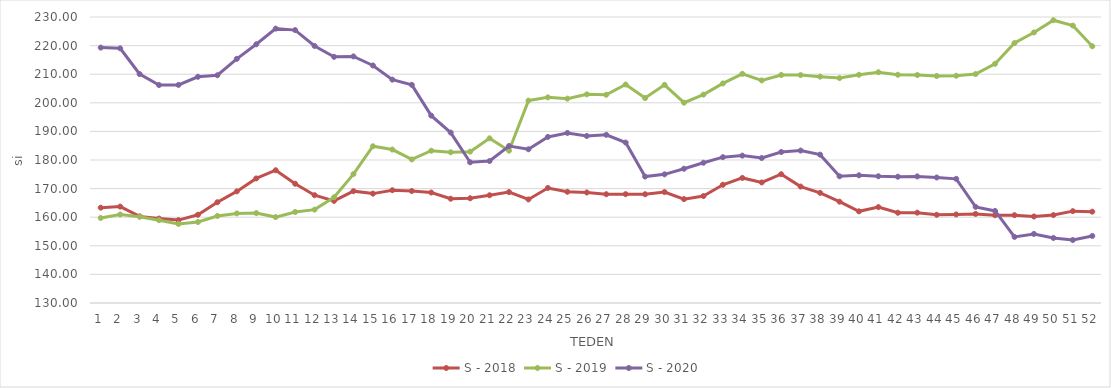
| Category | S - 2018 | S - 2019 | S - 2020 |
|---|---|---|---|
| 1.0 | 163.34 | 159.72 | 219.3 |
| 2.0 | 163.71 | 160.94 | 219.04 |
| 3.0 | 160.29 | 160.19 | 210.06 |
| 4.0 | 159.52 | 158.96 | 206.21 |
| 5.0 | 158.99 | 157.65 | 206.26 |
| 6.0 | 160.85 | 158.31 | 209.09 |
| 7.0 | 165.22 | 160.43 | 209.63 |
| 8.0 | 169.03 | 161.33 | 215.37 |
| 9.0 | 173.56 | 161.44 | 220.46 |
| 10.0 | 176.42 | 160.04 | 225.94 |
| 11.0 | 171.7 | 161.83 | 225.42 |
| 12.0 | 167.69 | 162.65 | 219.88 |
| 13.0 | 165.71 | 166.97 | 216.08 |
| 14.0 | 169.11 | 175.07 | 216.22 |
| 15.0 | 168.25 | 184.81 | 213.05 |
| 16.0 | 169.43 | 183.65 | 208.1 |
| 17.0 | 169.16 | 180.19 | 206.28 |
| 18.0 | 168.63 | 183.24 | 195.51 |
| 19.0 | 166.46 | 182.7 | 189.59 |
| 20.0 | 166.62 | 182.92 | 179.2 |
| 21.0 | 167.67 | 187.57 | 179.64 |
| 22.0 | 168.79 | 183.26 | 184.89 |
| 23.0 | 166.21 | 200.77 | 183.75 |
| 24.0 | 170.22 | 201.9 | 188.07 |
| 25.0 | 168.89 | 201.45 | 189.46 |
| 26.0 | 168.65 | 202.949 | 188.4 |
| 27.0 | 168.03 | 202.8 | 188.81 |
| 28.0 | 168.06 | 206.39 | 186.1 |
| 29.0 | 168.03 | 201.66 | 174.2 |
| 30.0 | 168.8 | 206.29 | 174.99 |
| 31.0 | 166.32 | 200.04 | 176.94 |
| 32.0 | 167.39 | 202.86 | 179.04 |
| 33.0 | 171.34 | 206.77 | 180.99 |
| 34.0 | 173.73 | 210.13 | 181.53 |
| 35.0 | 172.15 | 207.82 | 180.69 |
| 36.0 | 175.03 | 209.72 | 182.79 |
| 37.0 | 170.71 | 209.69 | 183.3 |
| 38.0 | 168.52 | 209.15 | 181.87 |
| 39.0 | 165.43 | 208.64 | 174.3 |
| 40.0 | 162.05 | 209.8 | 174.65 |
| 41.0 | 163.53 | 210.69 | 174.32 |
| 42.0 | 161.56 | 209.81 | 174.16 |
| 43.0 | 161.59 | 209.71 | 174.26 |
| 44.0 | 160.84 | 209.38 | 173.88 |
| 45.0 | 160.96 | 209.46 | 173.41 |
| 46.0 | 161.15 | 210.05 | 163.62 |
| 47.0 | 160.69 | 213.64 | 162.18 |
| 48.0 | 160.7 | 220.89 | 153.11 |
| 49.0 | 160.25 | 224.59 | 154.15 |
| 50.0 | 160.74 | 228.87 | 152.74 |
| 51.0 | 162.12 | 227 | 152.03 |
| 52.0 | 161.93 | 219.77 | 153.44 |